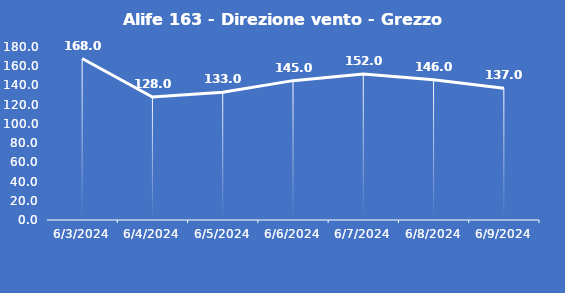
| Category | Alife 163 - Direzione vento - Grezzo (°N) |
|---|---|
| 6/3/24 | 168 |
| 6/4/24 | 128 |
| 6/5/24 | 133 |
| 6/6/24 | 145 |
| 6/7/24 | 152 |
| 6/8/24 | 146 |
| 6/9/24 | 137 |